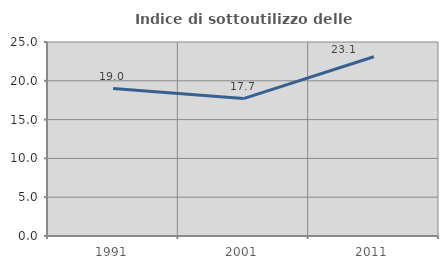
| Category | Indice di sottoutilizzo delle abitazioni  |
|---|---|
| 1991.0 | 19 |
| 2001.0 | 17.708 |
| 2011.0 | 23.105 |